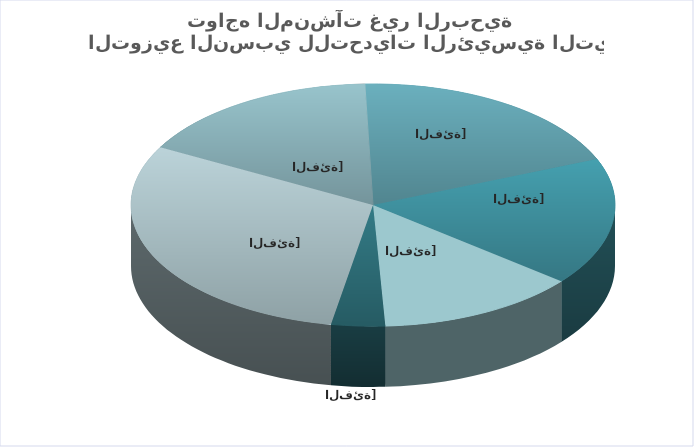
| Category | Percentage |
|---|---|
| تحديات في التدفقات المالية | 0.302 |
| تحديات في التعامل مع البنوك | 0.165 |
| تحديات في توظيف أيدي عاملة ماهرة | 0.193 |
| صعوبة الحصول على متطوعين | 0.17 |
| إجراءات الرقابة من الجهات الحكومية | 0.134 |
| نصوص الأنظمة واللوائح التشريعية | 0.036 |